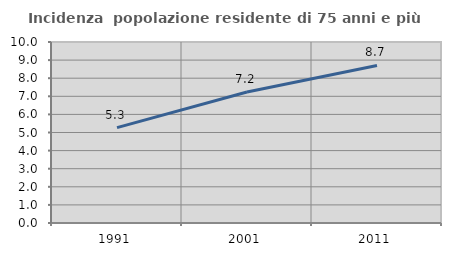
| Category | Incidenza  popolazione residente di 75 anni e più |
|---|---|
| 1991.0 | 5.272 |
| 2001.0 | 7.236 |
| 2011.0 | 8.707 |